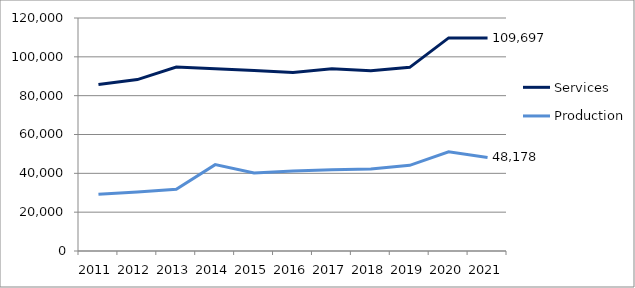
| Category | Services | Production |
|---|---|---|
| 2011.0 | 85729 | 29185 |
| 2012.0 | 88282 | 30347 |
| 2013.0 | 94703 | 31770 |
| 2014.0 | 93800 | 44472 |
| 2015.0 | 92959 | 40184 |
| 2016.0 | 91936 | 41208 |
| 2017.0 | 93849 | 41895 |
| 2018.0 | 92822 | 42268 |
| 2019.0 | 94579 | 44103 |
| 2020.0 | 109738 | 51115 |
| 2021.0 | 109697 | 48178 |